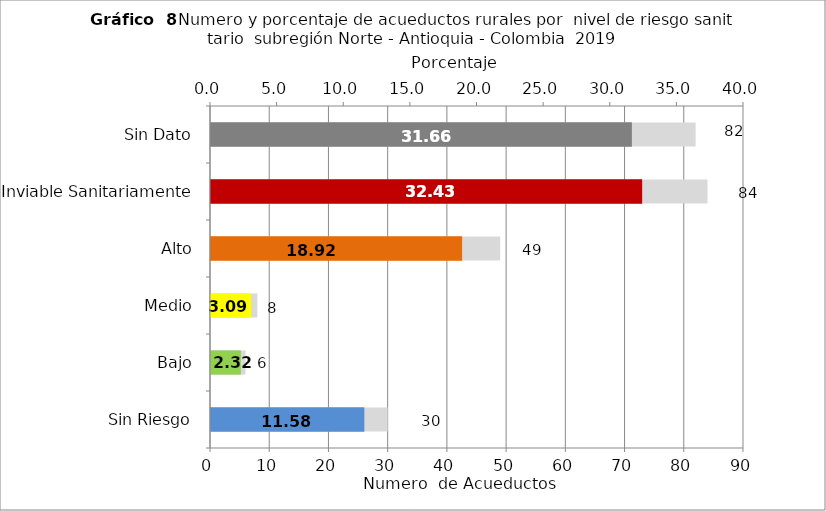
| Category | Número de Sistemas |
|---|---|
| Sin Riesgo | 30 |
| Bajo | 6 |
| Medio | 8 |
| Alto | 49 |
| Inviable Sanitariamente | 84 |
| Sin Dato | 82 |